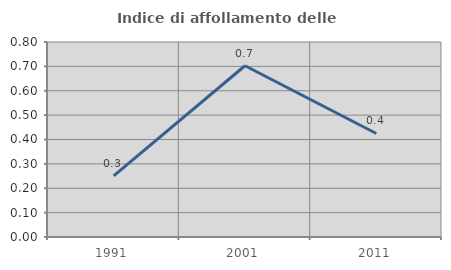
| Category | Indice di affollamento delle abitazioni  |
|---|---|
| 1991.0 | 0.251 |
| 2001.0 | 0.703 |
| 2011.0 | 0.425 |